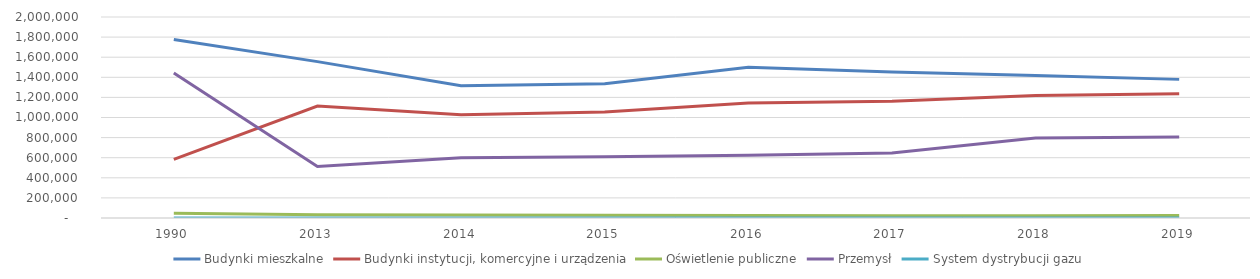
| Category | Budynki mieszkalne | Budynki instytucji, komercyjne i urządzenia | Oświetlenie publiczne | Przemysł | System dystrybucji gazu |
|---|---|---|---|---|---|
| 1990.0 | 1777035 | 583207 | 46541 | 1442928 | 169 |
| 2013.0 | 1555853 | 1114007 | 33413 | 513222 | 97 |
| 2014.0 | 1316260 | 1027686 | 29702 | 599911 | 97 |
| 2015.0 | 1335603 | 1054596 | 26838 | 610393 | 110 |
| 2016.0 | 1499768 | 1145131 | 24256 | 623177 | 110 |
| 2017.0 | 1452910 | 1162780 | 23418 | 646077 | 110 |
| 2018.0 | 1417181 | 1217941 | 22534 | 796956 | 102 |
| 2019.0 | 1379351 | 1235521 | 25185 | 806825 | 102 |